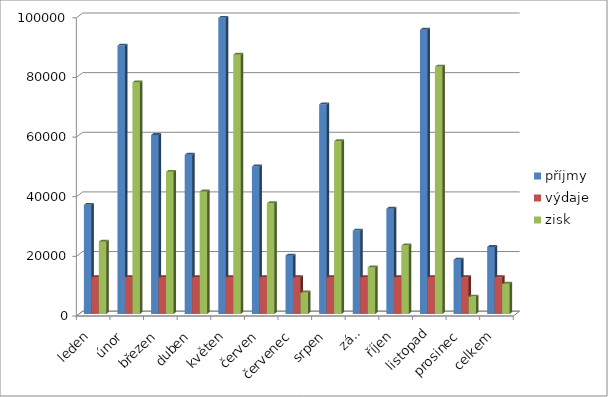
| Category | příjmy | výdaje | zisk |
|---|---|---|---|
| leden | 36598 | 12345 | 24253 |
| únor | 90012 | 12346 | 77666 |
| březen | 60022 | 12347 | 47675 |
| duben | 53402 | 12348 | 41054 |
| květen | 99305 | 12349 | 86956 |
| červen | 49465 | 12350 | 37115 |
| červenec | 19560 | 12351 | 7209 |
| srpen | 70284 | 12352 | 57932 |
| září | 27967 | 12353 | 15614 |
| říjen | 35299 | 12354 | 22945 |
| listopad | 95311 | 12355 | 82956 |
| prosinec | 18183 | 12356 | 5827 |
| celkem | 22482 | 12357 | 10125 |